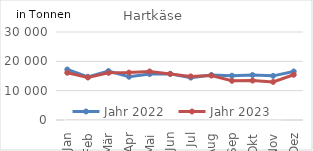
| Category | Jahr 2022 | Jahr 2023 |
|---|---|---|
| Jan | 17219.363 | 16100.879 |
| Feb | 14719.256 | 14493.657 |
| Mär | 16685.773 | 16074.977 |
| Apr | 14741.311 | 16157.134 |
| Mai | 15655.714 | 16559.323 |
| Jun | 15745.173 | 15694.938 |
| Jul | 14451.356 | 14870.119 |
| Aug | 15327.707 | 15164.626 |
| Sep | 15102.48 | 13356.112 |
| Okt | 15321.749 | 13447.514 |
| Nov | 15049.603 | 12985.027 |
| Dez | 16545.429 | 15433.699 |